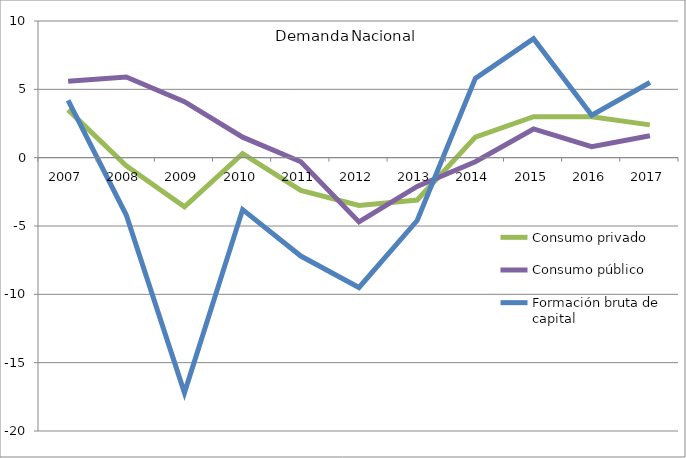
| Category | Consumo privado | Consumo público | Formación bruta de capital |
|---|---|---|---|
| 2007.0 | 3.5 | 5.6 | 4.2 |
| 2008.0 | -0.6 | 5.9 | -4.2 |
| 2009.0 | -3.6 | 4.1 | -17.2 |
| 2010.0 | 0.3 | 1.5 | -3.8 |
| 2011.0 | -2.4 | -0.3 | -7.2 |
| 2012.0 | -3.5 | -4.7 | -9.5 |
| 2013.0 | -3.1 | -2.1 | -4.6 |
| 2014.0 | 1.5 | -0.3 | 5.8 |
| 2015.0 | 3 | 2.1 | 8.7 |
| 2016.0 | 3 | 0.8 | 3.1 |
| 2017.0 | 2.4 | 1.6 | 5.5 |